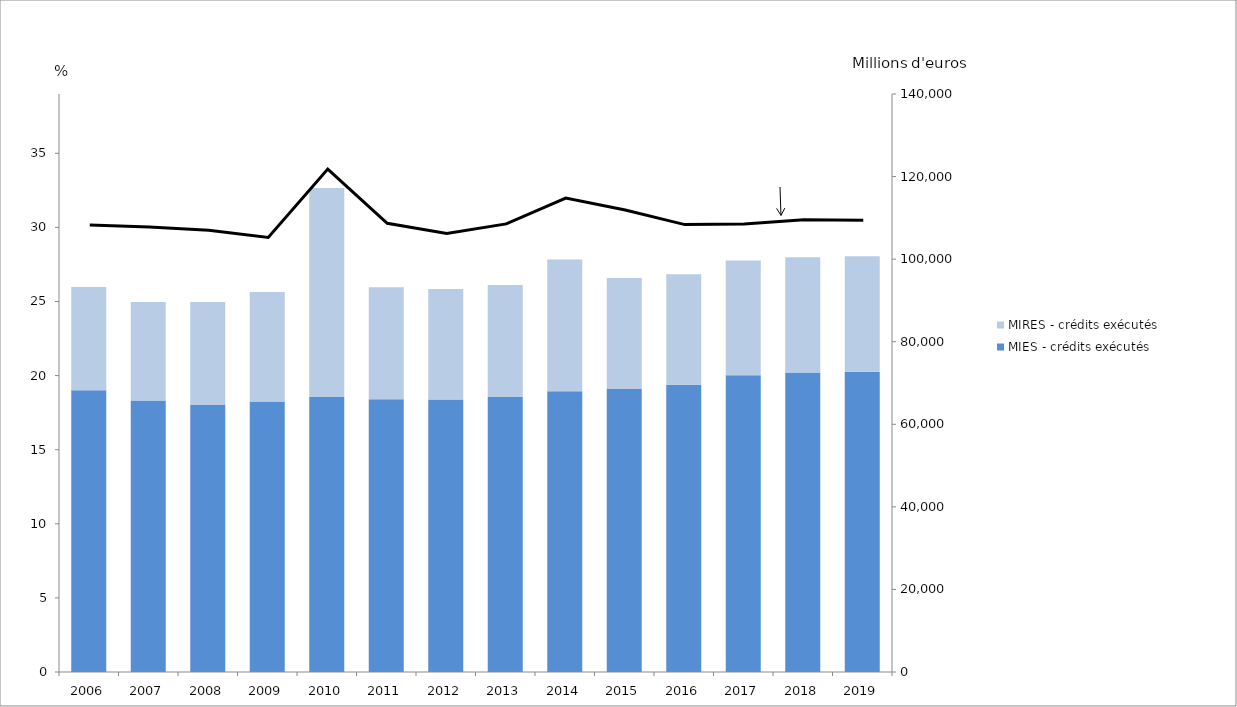
| Category | MIES - crédits exécutés  | MIRES - crédits exécutés |
|---|---|---|
| 2006.0 | 68254.171 | 24994.878 |
| 2007.0 | 65771.778 | 23874.569 |
| 2008.0 | 64683.49 | 24926.706 |
| 2009.0 | 65508.705 | 26556.677 |
| 2010.0 | 66596.325 | 50658.47 |
| 2011.0 | 66066.226 | 27130.59 |
| 2012.0 | 65995.708 | 26759.424 |
| 2013.0 | 66632.438 | 27095.217 |
| 2014.0 | 67999.709 | 31909.604 |
| 2015.0 | 68560.149 | 26854.022 |
| 2016.0 | 69573.298 | 26786.917 |
| 2017.0 | 71869.515 | 27797.576 |
| 2018.0 | 72540.548 | 27917.082 |
| 2019.0 | 72715.637 | 27964.038 |